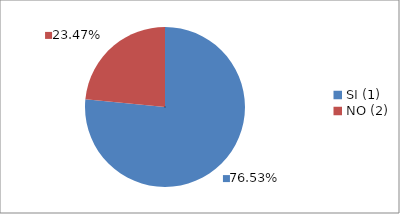
| Category | Series 0 |
|---|---|
| SI (1) | 0.765 |
| NO (2) | 0.235 |